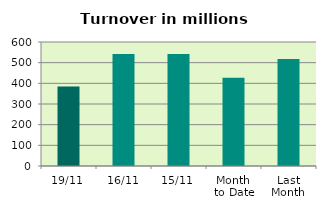
| Category | Series 0 |
|---|---|
| 19/11 | 384.142 |
| 16/11 | 541.925 |
| 15/11 | 541.613 |
| Month 
to Date | 427.534 |
| Last
Month | 517.71 |